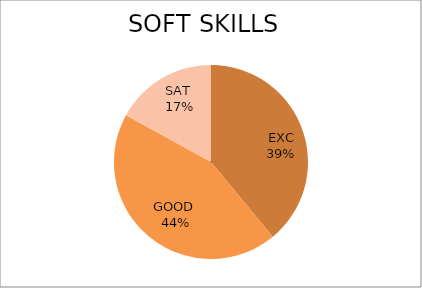
| Category | Series 0 |
|---|---|
| EXC | 39 |
| GOOD  | 44 |
| SAT  | 17 |